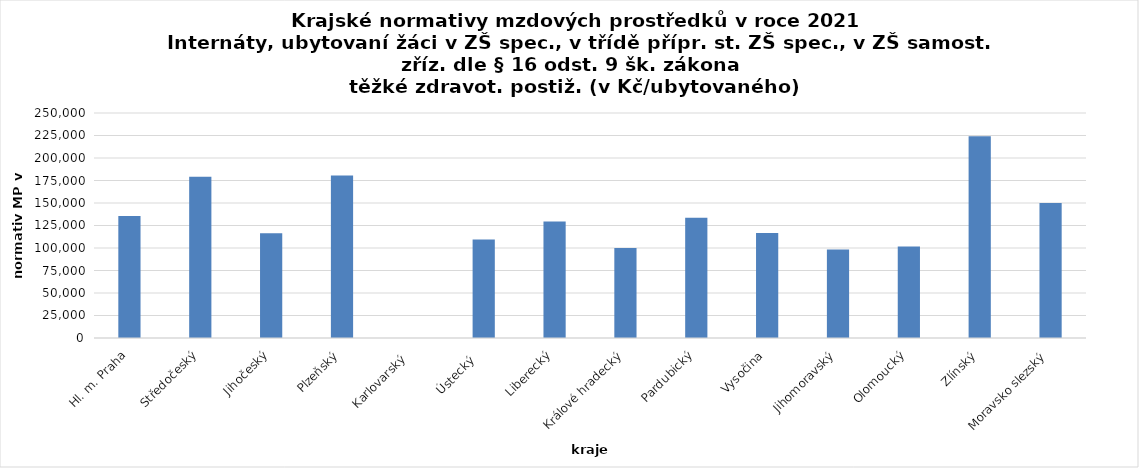
| Category | Series 0 |
|---|---|
| Hl. m. Praha | 135428.057 |
| Středočeský | 179089.91 |
| Jihočeský | 116424.861 |
| Plzeňský | 180611.997 |
| Karlovarský  | 0 |
| Ústecký   | 109554.222 |
| Liberecký | 129391.341 |
| Králové hradecký | 100120.677 |
| Pardubický | 133482.526 |
| Vysočina | 116726.41 |
| Jihomoravský | 98274.014 |
| Olomoucký | 101804.97 |
| Zlínský | 224169.712 |
| Moravsko slezský | 149969.462 |